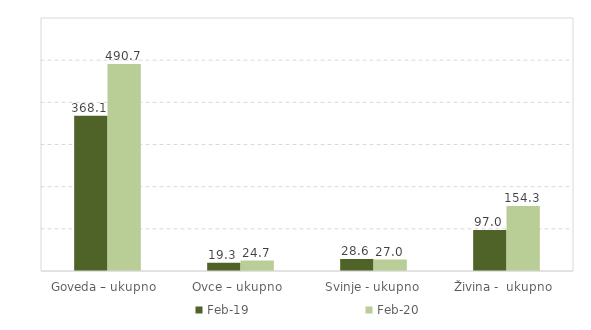
| Category | Feb-19 | Feb-20 |
|---|---|---|
| Goveda – ukupno  | 368.1 | 490.7 |
| Ovce – ukupno  | 19.3 | 24.7 |
| Svinje - ukupno | 28.6 | 27 |
| Živina -  ukupno  | 97 | 154.3 |